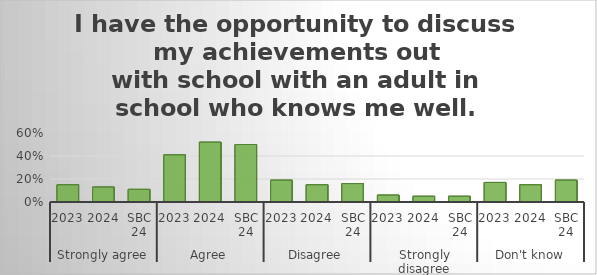
| Category | I have the opportunity to discuss my achievements out with school with an adult in school who knows me well. |
|---|---|
| 0 | 0.15 |
| 1 | 0.13 |
| 2 | 0.11 |
| 3 | 0.41 |
| 4 | 0.52 |
| 5 | 0.5 |
| 6 | 0.19 |
| 7 | 0.15 |
| 8 | 0.16 |
| 9 | 0.06 |
| 10 | 0.05 |
| 11 | 0.05 |
| 12 | 0.17 |
| 13 | 0.15 |
| 14 | 0.19 |